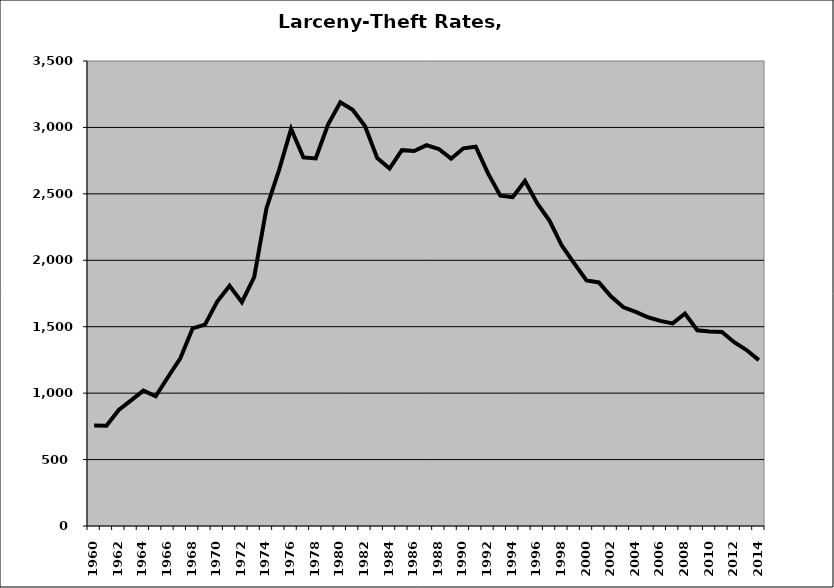
| Category | Larceny-Theft |
|---|---|
| 1960.0 | 756.628 |
| 1961.0 | 755.045 |
| 1962.0 | 872.954 |
| 1963.0 | 945.889 |
| 1964.0 | 1018.737 |
| 1965.0 | 976.926 |
| 1966.0 | 1121.687 |
| 1967.0 | 1262.488 |
| 1968.0 | 1487.836 |
| 1969.0 | 1515.613 |
| 1970.0 | 1689.387 |
| 1971.0 | 1807.658 |
| 1972.0 | 1685.259 |
| 1973.0 | 1873.373 |
| 1974.0 | 2392.21 |
| 1975.0 | 2672.458 |
| 1976.0 | 2988.918 |
| 1977.0 | 2774.526 |
| 1978.0 | 2766.835 |
| 1979.0 | 3021.713 |
| 1980.0 | 3189.25 |
| 1981.0 | 3132.631 |
| 1982.0 | 3011.266 |
| 1983.0 | 2768.854 |
| 1984.0 | 2690.366 |
| 1985.0 | 2828.709 |
| 1986.0 | 2822.48 |
| 1987.0 | 2866.345 |
| 1988.0 | 2837.902 |
| 1989.0 | 2764.71 |
| 1990.0 | 2842.971 |
| 1991.0 | 2854.948 |
| 1992.0 | 2653.563 |
| 1993.0 | 2486.052 |
| 1994.0 | 2474.924 |
| 1995.0 | 2597.093 |
| 1996.0 | 2428.155 |
| 1997.0 | 2297.02 |
| 1998.0 | 2109.254 |
| 1999.0 | 1976.788 |
| 2000.0 | 1848.77 |
| 2001.0 | 1833.261 |
| 2002.0 | 1726.608 |
| 2003.0 | 1646.381 |
| 2004.0 | 1611.679 |
| 2005.0 | 1571.017 |
| 2006.0 | 1543.528 |
| 2007.0 | 1524.697 |
| 2008.0 | 1599.199 |
| 2009.0 | 1473.436 |
| 2010.0 | 1464.463 |
| 2011.0 | 1460.886 |
| 2012.0 | 1383.237 |
| 2013.0 | 1324.188 |
| 2014.0 | 1248.331 |